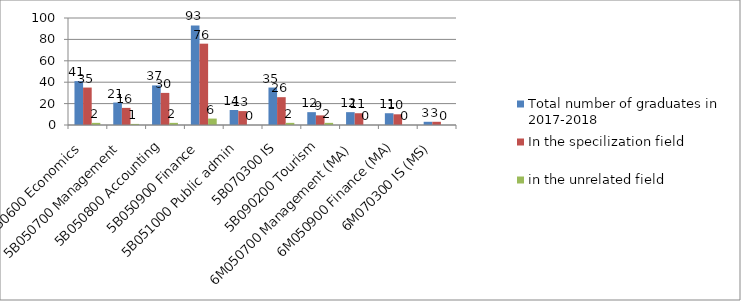
| Category | Total number of graduates in 2017-2018 | In the specilization field | in the unrelated field |
|---|---|---|---|
| 5В050600 Economics | 41 | 35 | 2 |
| 5В050700 Management | 21 | 16 | 1 |
| 5В050800 Accounting | 37 | 30 | 2 |
| 5В050900 Finance | 93 | 76 | 6 |
| 5В051000 Public admin | 14 | 13 | 0 |
| 5В070300 IS | 35 | 26 | 2 |
| 5В090200 Tourism | 12 | 9 | 2 |
| 6М050700 Management (MA) | 12 | 11 | 0 |
| 6М050900 Finance (MA) | 11 | 10 | 0 |
| 6М070300 IS (MS) | 3 | 3 | 0 |